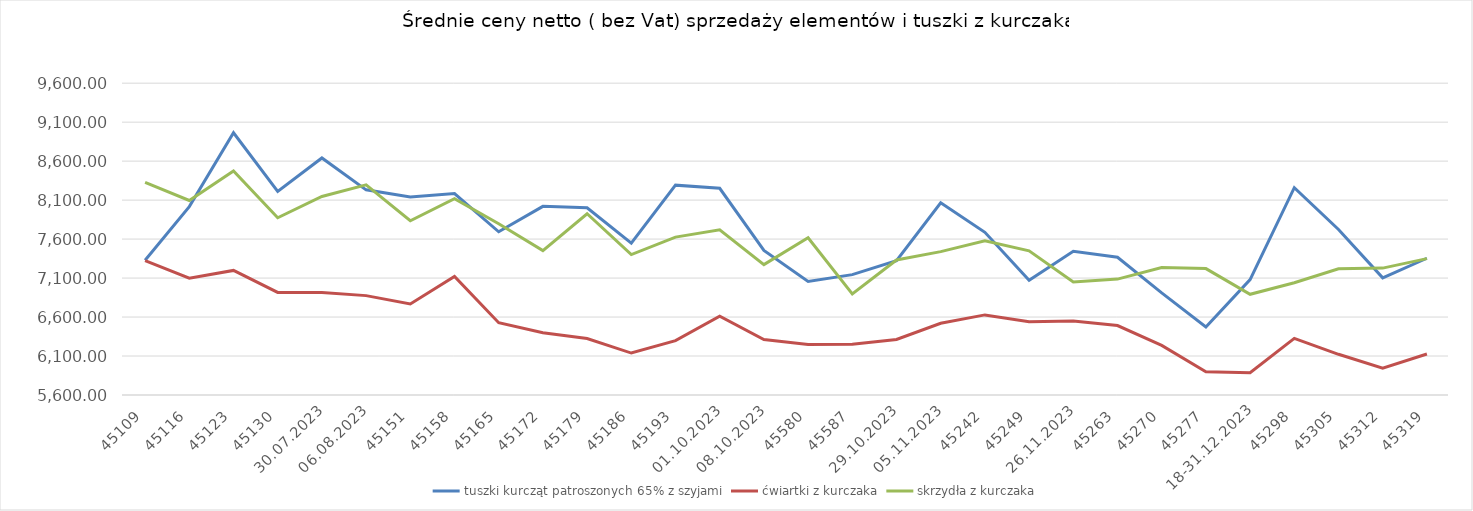
| Category | tuszki kurcząt patroszonych 65% z szyjami | ćwiartki z kurczaka | skrzydła z kurczaka |
|---|---|---|---|
| 02.07.2023 | 7328.046 | 7324.109 | 8326.527 |
| 09.07.2023 | 8016.777 | 7098.27 | 8094.96 |
| 16.07.2023 | 8964.293 | 7198.29 | 8473.842 |
| 23.07.2023 | 8210.968 | 6915.341 | 7873.405 |
| 30.07.2023 | 8641.055 | 6914.299 | 8146.391 |
| 06.08.2023 | 8231.69 | 6874.892 | 8296.098 |
| 13.08.2023 | 8141.343 | 6768.317 | 7834.812 |
| 20.08.2023 | 8183.942 | 7120.595 | 8117.301 |
| 27.08.2023 | 7694.006 | 6527.856 | 7797.118 |
| 03.09.2023 | 8019.923 | 6398.595 | 7453.135 |
| 10.09.2023 | 8002.223 | 6324.864 | 7925.396 |
| 17.09.2023 | 7548.858 | 6138.11 | 7401.082 |
| 24.09.2023 | 8291.69 | 6296.745 | 7625.209 |
| 01.10.2023 | 8251.886 | 6609.781 | 7719.91 |
| 08.10.2023 | 7454.364 | 6311.623 | 7272.807 |
| 15.10.2024 | 7055.75 | 6248.448 | 7617.323 |
| 22.10.2024 | 7144.159 | 6250.258 | 6896.877 |
| 29.10.2023 | 7322.99 | 6311.787 | 7332.362 |
| 05.11.2023 | 8066.152 | 6519.504 | 7439.29 |
| 12.11.2023 | 7686.53 | 6627.524 | 7579.028 |
| 19.11.2023 | 7071.186 | 6539.795 | 7449.089 |
| 26.11.2023 | 7443.977 | 6550.566 | 7049.304 |
| 03.12.2023 | 7366.394 | 6490.72 | 7086.674 |
| 10.12.2023 | 6909.655 | 6235.778 | 7235.395 |
| 17.12.2023 | 6473.312 | 5898 | 7221.281 |
| 18-31.12.2023 | 7080.571 | 5885.824 | 6891.615 |
| 07.01.2024 | 8259.273 | 6326.469 | 7039.958 |
| 14.01.2024 | 7722.939 | 6122.131 | 7220.132 |
| 21.01.2024 | 7102.861 | 5945.043 | 7227.704 |
| 28.01.2024 | 7354.251 | 6125.371 | 7349.242 |